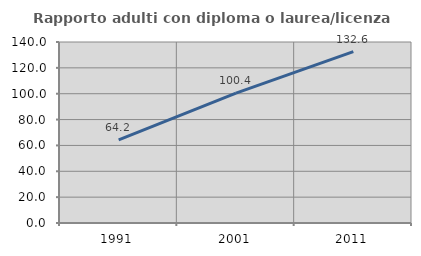
| Category | Rapporto adulti con diploma o laurea/licenza media  |
|---|---|
| 1991.0 | 64.238 |
| 2001.0 | 100.394 |
| 2011.0 | 132.567 |